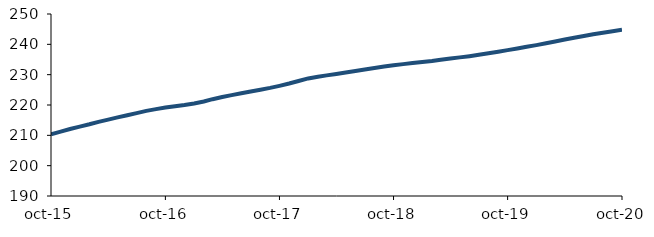
| Category | Series 0 |
|---|---|
| 2015-10-01 | 210.37 |
| 2015-11-01 | 211.212 |
| 2015-12-01 | 212.071 |
| 2016-01-01 | 212.858 |
| 2016-02-01 | 213.636 |
| 2016-03-01 | 214.437 |
| 2016-04-01 | 215.192 |
| 2016-05-01 | 215.912 |
| 2016-06-01 | 216.639 |
| 2016-07-01 | 217.337 |
| 2016-08-01 | 218.055 |
| 2016-09-01 | 218.65 |
| 2016-10-01 | 219.169 |
| 2016-11-01 | 219.609 |
| 2016-12-01 | 220.005 |
| 2017-01-01 | 220.507 |
| 2017-02-01 | 221.16 |
| 2017-03-01 | 221.915 |
| 2017-04-01 | 222.613 |
| 2017-05-01 | 223.245 |
| 2017-06-01 | 223.858 |
| 2017-07-01 | 224.458 |
| 2017-08-01 | 225.032 |
| 2017-09-01 | 225.639 |
| 2017-10-01 | 226.319 |
| 2017-11-01 | 227.091 |
| 2017-12-01 | 227.928 |
| 2018-01-01 | 228.757 |
| 2018-02-01 | 229.33 |
| 2018-03-01 | 229.772 |
| 2018-04-01 | 230.22 |
| 2018-05-01 | 230.681 |
| 2018-06-01 | 231.179 |
| 2018-07-01 | 231.685 |
| 2018-08-01 | 232.189 |
| 2018-09-01 | 232.666 |
| 2018-10-01 | 233.101 |
| 2018-11-01 | 233.479 |
| 2018-12-01 | 233.833 |
| 2019-01-01 | 234.138 |
| 2019-02-01 | 234.495 |
| 2019-03-01 | 234.907 |
| 2019-04-01 | 235.31 |
| 2019-05-01 | 235.703 |
| 2019-06-01 | 236.101 |
| 2019-07-01 | 236.555 |
| 2019-08-01 | 237.038 |
| 2019-09-01 | 237.55 |
| 2019-10-01 | 238.082 |
| 2019-11-01 | 238.622 |
| 2019-12-01 | 239.173 |
| 2020-01-01 | 239.736 |
| 2020-02-01 | 240.361 |
| 2020-03-01 | 240.917 |
| 2020-04-01 | 241.568 |
| 2020-05-01 | 242.157 |
| 2020-06-01 | 242.754 |
| 2020-07-01 | 243.298 |
| 2020-08-01 | 243.814 |
| 2020-09-01 | 244.314 |
| 2020-10-01 | 244.837 |